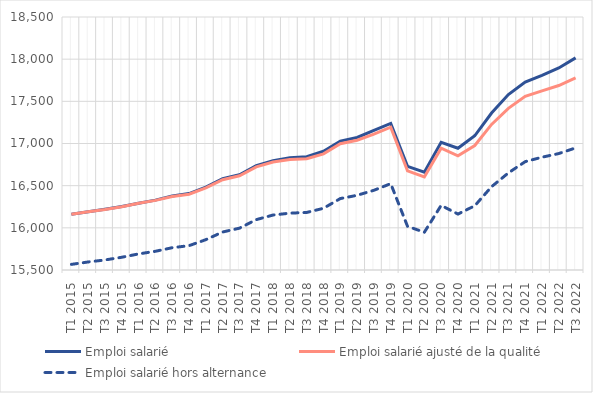
| Category | Emploi salarié | Emploi salarié ajusté de la qualité | Emploi salarié hors alternance |
|---|---|---|---|
| T1 2015 | 16161 | 16161 | 15566.534 |
| T2 2015 | 16191.9 | 16191.436 | 15595.459 |
| T3 2015 | 16220.4 | 16217.819 | 15619.087 |
| T4 2015 | 16252.5 | 16250.597 | 15651.231 |
| T1 2016 | 16291.7 | 16290.797 | 15690.795 |
| T2 2016 | 16328.8 | 16325.427 | 15722.072 |
| T3 2016 | 16378.5 | 16372.071 | 15764.437 |
| T4 2016 | 16406.2 | 16398.328 | 15788.523 |
| T1 2017 | 16483.7 | 16473.891 | 15859.692 |
| T2 2017 | 16582 | 16570.053 | 15950.54 |
| T3 2017 | 16629.5 | 16617.415 | 15996.046 |
| T4 2017 | 16736.7 | 16723.453 | 16097.218 |
| T1 2018 | 16795.6 | 16781.15 | 16151.798 |
| T2 2018 | 16832.2 | 16810.46 | 16174.033 |
| T3 2018 | 16843.4 | 16820.326 | 16182.446 |
| T4 2018 | 16907.6 | 16877.523 | 16231.844 |
| T1 2019 | 17027.8 | 16997.407 | 16347.058 |
| T2 2019 | 17071.8 | 17039.341 | 16385.779 |
| T3 2019 | 17156 | 17111.269 | 16445.233 |
| T4 2019 | 17238.4 | 17193.21 | 16523.791 |
| T1 2020 | 16729.7 | 16675.166 | 16017.473 |
| T2 2020 | 16660.5 | 16604.061 | 15947.5 |
| T3 2020 | 17014.2 | 16945.101 | 16266.129 |
| T4 2020 | 16943.5 | 16854.328 | 16163.42 |
| T1 2021 | 17091.5 | 16976.235 | 16261.428 |
| T2 2021 | 17361.7 | 17226.498 | 16487.906 |
| T3 2021 | 17580.1 | 17416.745 | 16651.037 |
| T4 2021 | 17728.3 | 17559.562 | 16784.74 |
| T1 2022 | 17808.2 | 17624.844 | 16837.407 |
| T2 2022 | 17895.7 | 17687.552 | 16880.779 |
| T3 2022 | 18015.5 | 17777.46 | 16947.244 |